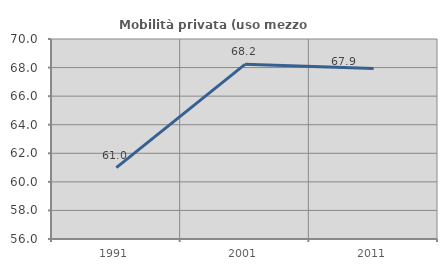
| Category | Mobilità privata (uso mezzo privato) |
|---|---|
| 1991.0 | 61 |
| 2001.0 | 68.226 |
| 2011.0 | 67.942 |